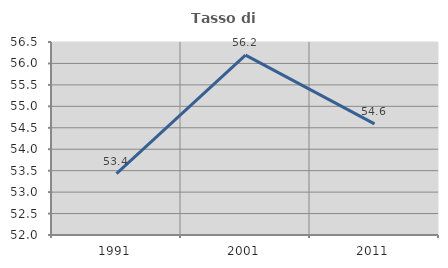
| Category | Tasso di occupazione   |
|---|---|
| 1991.0 | 53.429 |
| 2001.0 | 56.195 |
| 2011.0 | 54.592 |